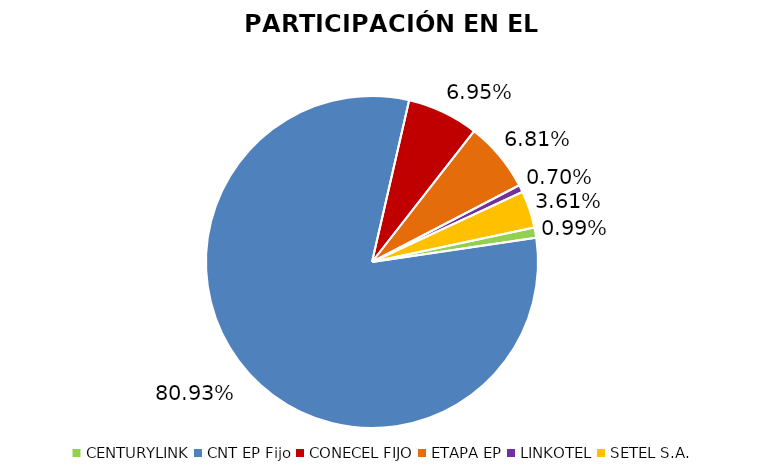
| Category | Participación en el Mercado |
|---|---|
| CENTURYLINK | 0.01 |
| CNT EP Fijo | 0.809 |
| CONECEL FIJO | 0.069 |
| ETAPA EP | 0.068 |
| LINKOTEL | 0.007 |
| SETEL S.A. | 0.036 |